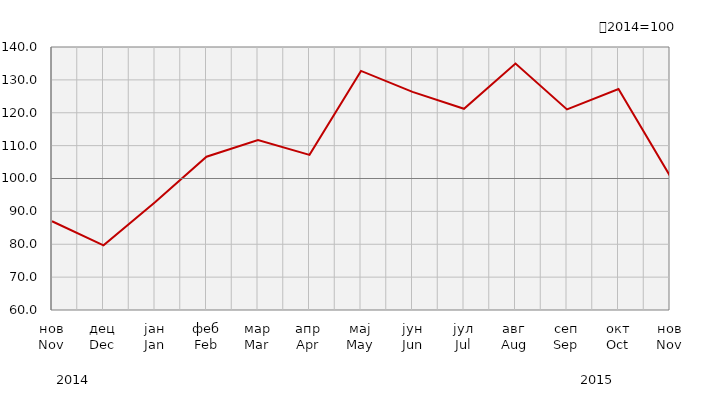
| Category | Индекси ноћења туриста
Tourist night indices |
|---|---|
| нов
Nov | 86.993 |
| дец
Dec | 79.66 |
| јан
Jan | 92.8 |
| феб
Feb | 106.635 |
| мар
Mar | 111.734 |
| апр
Apr | 107.182 |
| мај
May | 132.731 |
| јун
Jun | 126.332 |
| јул
Jul | 121.211 |
| авг
Aug | 134.96 |
| сеп
Sep | 121.017 |
| окт
Oct | 127.232 |
| нов
Nov | 100.788 |